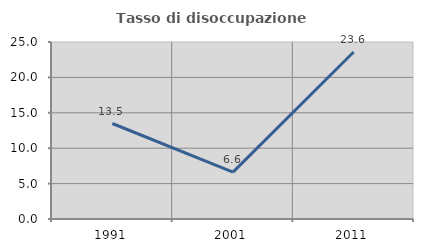
| Category | Tasso di disoccupazione giovanile  |
|---|---|
| 1991.0 | 13.488 |
| 2001.0 | 6.618 |
| 2011.0 | 23.585 |